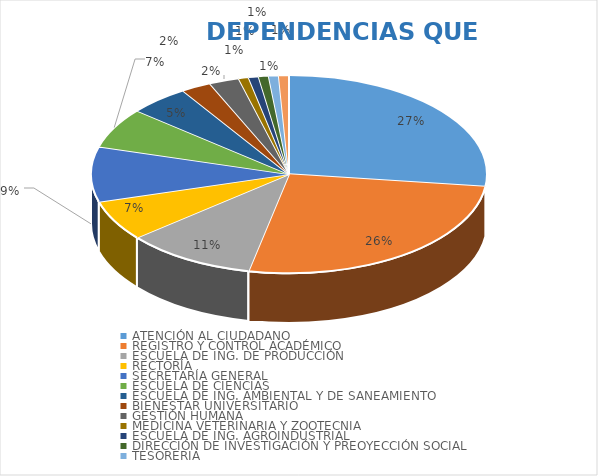
| Category | Series 0 |
|---|---|
| ATENCIÓN AL CIUDADANO | 0.27 |
| REGISTRO Y CONTROL ACADÉMICO | 0.262 |
| ESCUELA DE ING. DE PRODUCCIÓN | 0.107 |
| RECTORÍA | 0.066 |
| SECRETARÍA GENERAL | 0.09 |
| ESCUELA DE CIENCIAS | 0.066 |
| ESCUELA DE ING. AMBIENTAL Y DE SANEAMIENTO | 0.049 |
| BIENESTAR UNIVERSITARIO | 0.025 |
| GESTIÓN HUMANA | 0.025 |
| MEDICINA VETERINARIA Y ZOOTECNIA  | 0.008 |
| ESCUELA DE ING. AGROINDUSTRIAL | 0.008 |
| DIRECCIÓN DE INVESTIGACIÓN Y PREOYECCIÓN SOCIAL | 0.008 |
| TESORERIA | 0.008 |
| DIRECCIÓN CENTRO DE INFORMACIÓN | 0.008 |